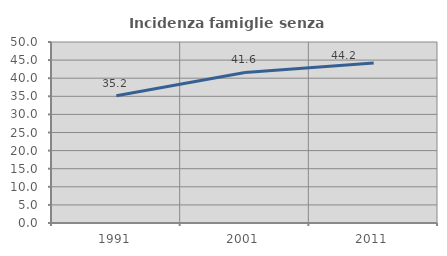
| Category | Incidenza famiglie senza nuclei |
|---|---|
| 1991.0 | 35.167 |
| 2001.0 | 41.593 |
| 2011.0 | 44.218 |